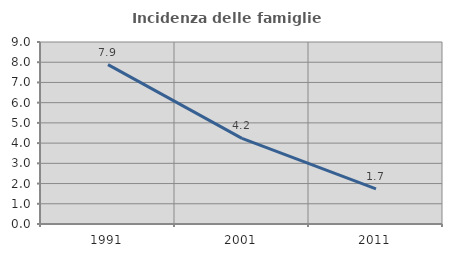
| Category | Incidenza delle famiglie numerose |
|---|---|
| 1991.0 | 7.881 |
| 2001.0 | 4.232 |
| 2011.0 | 1.739 |